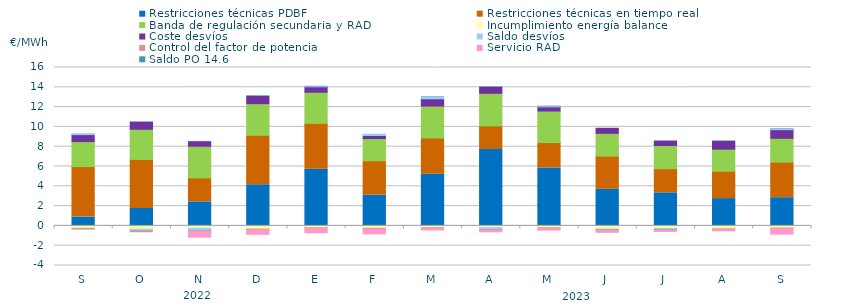
| Category | Restricciones técnicas PDBF | Restricciones técnicas en tiempo real | Banda de regulación secundaria y RAD | Incumplimiento energía balance | Coste desvíos | Saldo desvíos | Control del factor de potencia | Servicio RAD | Saldo PO 14.6 |
|---|---|---|---|---|---|---|---|---|---|
| S | 0.89 | 5.1 | 2.53 | -0.25 | 0.7 | 0.04 | -0.07 | 0 | 0.03 |
| O | 1.76 | 4.95 | 3.05 | -0.34 | 0.72 | -0.17 | -0.08 | 0 | 0.03 |
| N | 2.42 | 2.43 | 3.2 | -0.25 | 0.46 | -0.25 | -0.09 | -0.64 | 0.02 |
| D | 4.16 | 4.99 | 3.2 | -0.32 | 0.72 | 0 | -0.08 | -0.55 | 0.07 |
| E | 5.72 | 4.63 | 3.15 | -0.19 | 0.55 | 0.01 | -0.08 | -0.53 | 0.04 |
| F | 3.1 | 3.47 | 2.25 | -0.25 | 0.31 | 0.11 | -0.08 | -0.57 | 0.01 |
| M | 5.22 | 3.66 | 3.23 | -0.18 | 0.73 | 0.17 | -0.09 | -0.24 | 0.05 |
| A | 7.72 | 2.38 | 3.29 | -0.18 | 0.6 | -0.21 | -0.09 | -0.22 | 0.06 |
| M | 5.85 | 2.563 | 3.19 | -0.19 | 0.42 | 0.02 | -0.09 | -0.25 | 0.05 |
| J | 3.69 | 3.36 | 2.3 | -0.31 | 0.51 | -0.08 | -0.09 | -0.25 | -0.02 |
| J | 3.34 | 2.44 | 2.34 | -0.25 | 0.44 | -0.14 | -0.07 | -0.2 | 0.04 |
| A | 2.76 | 2.76 | 2.23 | -0.3 | 0.79 | 0 | -0.08 | -0.22 | 0.05 |
| S | 2.85 | 3.59 | 2.41 | -0.22 | 0.87 | 0.07 | -0.07 | -0.65 | 0.05 |